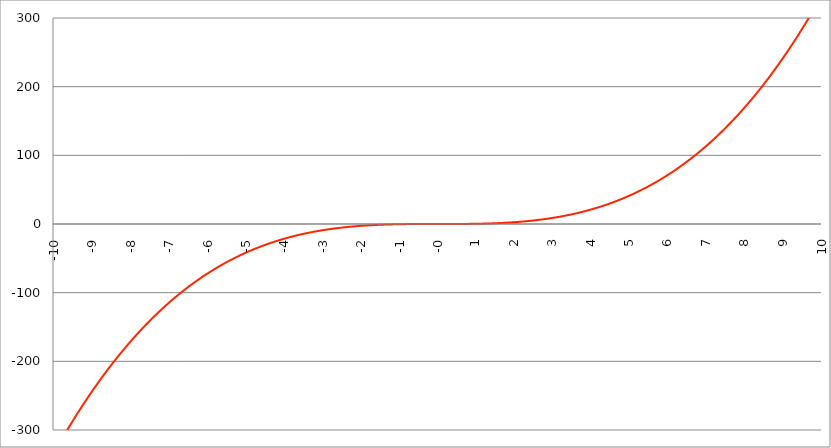
| Category | Series 1 |
|---|---|
| -10.0 | -333.333 |
| -9.99 | -332.334 |
| -9.98 | -331.337 |
| -9.97 | -330.342 |
| -9.96 | -329.349 |
| -9.95 | -328.358 |
| -9.940000000000001 | -327.369 |
| -9.930000000000001 | -326.382 |
| -9.920000000000002 | -325.397 |
| -9.91 | -324.414 |
| -9.900000000000002 | -323.433 |
| -9.890000000000002 | -322.454 |
| -9.880000000000003 | -321.477 |
| -9.870000000000003 | -320.502 |
| -9.860000000000001 | -319.528 |
| -9.850000000000003 | -318.557 |
| -9.840000000000003 | -317.588 |
| -9.830000000000004 | -316.621 |
| -9.820000000000004 | -315.655 |
| -9.810000000000004 | -314.692 |
| -9.800000000000004 | -313.731 |
| -9.790000000000004 | -312.771 |
| -9.780000000000005 | -311.814 |
| -9.770000000000005 | -310.858 |
| -9.760000000000005 | -309.905 |
| -9.750000000000005 | -308.953 |
| -9.740000000000006 | -308.003 |
| -9.730000000000006 | -307.056 |
| -9.720000000000006 | -306.11 |
| -9.710000000000006 | -305.166 |
| -9.700000000000006 | -304.224 |
| -9.690000000000007 | -303.284 |
| -9.680000000000007 | -302.346 |
| -9.670000000000007 | -301.41 |
| -9.660000000000007 | -300.476 |
| -9.650000000000007 | -299.544 |
| -9.640000000000008 | -298.614 |
| -9.630000000000008 | -297.685 |
| -9.620000000000008 | -296.759 |
| -9.610000000000008 | -295.835 |
| -9.600000000000009 | -294.912 |
| -9.590000000000009 | -293.991 |
| -9.580000000000007 | -293.073 |
| -9.57000000000001 | -292.156 |
| -9.56000000000001 | -291.241 |
| -9.55000000000001 | -290.328 |
| -9.54000000000001 | -289.417 |
| -9.53000000000001 | -288.508 |
| -9.52000000000001 | -287.6 |
| -9.51000000000001 | -286.695 |
| -9.50000000000001 | -285.792 |
| -9.49000000000001 | -284.89 |
| -9.48000000000001 | -283.99 |
| -9.47000000000001 | -283.093 |
| -9.46000000000001 | -282.197 |
| -9.45000000000001 | -281.303 |
| -9.44000000000001 | -280.411 |
| -9.430000000000012 | -279.521 |
| -9.420000000000012 | -278.632 |
| -9.410000000000013 | -277.746 |
| -9.400000000000013 | -276.861 |
| -9.390000000000011 | -275.979 |
| -9.380000000000013 | -275.098 |
| -9.370000000000013 | -274.219 |
| -9.360000000000014 | -273.342 |
| -9.350000000000014 | -272.467 |
| -9.340000000000014 | -271.594 |
| -9.330000000000014 | -270.722 |
| -9.320000000000014 | -269.853 |
| -9.310000000000015 | -268.985 |
| -9.300000000000013 | -268.119 |
| -9.290000000000015 | -267.255 |
| -9.280000000000015 | -266.393 |
| -9.270000000000016 | -265.533 |
| -9.260000000000016 | -264.674 |
| -9.250000000000014 | -263.818 |
| -9.240000000000016 | -262.963 |
| -9.230000000000016 | -262.11 |
| -9.220000000000017 | -261.259 |
| -9.210000000000017 | -260.41 |
| -9.200000000000017 | -259.563 |
| -9.190000000000017 | -258.717 |
| -9.180000000000017 | -257.874 |
| -9.170000000000018 | -257.032 |
| -9.160000000000016 | -256.192 |
| -9.150000000000018 | -255.354 |
| -9.140000000000018 | -254.517 |
| -9.130000000000019 | -253.683 |
| -9.120000000000019 | -252.85 |
| -9.110000000000017 | -252.019 |
| -9.10000000000002 | -251.19 |
| -9.09000000000002 | -250.363 |
| -9.08000000000002 | -249.538 |
| -9.07000000000002 | -248.714 |
| -9.06000000000002 | -247.892 |
| -9.05000000000002 | -247.073 |
| -9.04000000000002 | -246.254 |
| -9.03000000000002 | -245.438 |
| -9.020000000000021 | -244.624 |
| -9.010000000000021 | -243.811 |
| -9.000000000000021 | -243 |
| -8.990000000000022 | -242.191 |
| -8.980000000000022 | -241.384 |
| -8.97000000000002 | -240.578 |
| -8.960000000000022 | -239.774 |
| -8.950000000000022 | -238.972 |
| -8.940000000000023 | -238.172 |
| -8.930000000000023 | -237.374 |
| -8.920000000000023 | -236.577 |
| -8.910000000000023 | -235.783 |
| -8.900000000000023 | -234.99 |
| -8.890000000000024 | -234.198 |
| -8.880000000000024 | -233.409 |
| -8.870000000000024 | -232.621 |
| -8.860000000000024 | -231.835 |
| -8.850000000000025 | -231.051 |
| -8.840000000000025 | -230.269 |
| -8.830000000000025 | -229.488 |
| -8.820000000000025 | -228.71 |
| -8.810000000000025 | -227.933 |
| -8.800000000000026 | -227.157 |
| -8.790000000000026 | -226.384 |
| -8.780000000000026 | -225.612 |
| -8.770000000000026 | -224.842 |
| -8.760000000000026 | -224.074 |
| -8.750000000000027 | -223.307 |
| -8.740000000000027 | -222.543 |
| -8.730000000000027 | -221.78 |
| -8.720000000000027 | -221.018 |
| -8.710000000000027 | -220.259 |
| -8.700000000000028 | -219.501 |
| -8.690000000000028 | -218.745 |
| -8.680000000000028 | -217.991 |
| -8.670000000000028 | -217.238 |
| -8.660000000000029 | -216.487 |
| -8.650000000000029 | -215.738 |
| -8.640000000000029 | -214.991 |
| -8.63000000000003 | -214.245 |
| -8.62000000000003 | -213.501 |
| -8.61000000000003 | -212.759 |
| -8.60000000000003 | -212.019 |
| -8.59000000000003 | -211.28 |
| -8.58000000000003 | -210.543 |
| -8.57000000000003 | -209.808 |
| -8.56000000000003 | -209.074 |
| -8.55000000000003 | -208.342 |
| -8.540000000000031 | -207.612 |
| -8.530000000000031 | -206.883 |
| -8.520000000000032 | -206.157 |
| -8.510000000000032 | -205.432 |
| -8.50000000000003 | -204.708 |
| -8.490000000000032 | -203.987 |
| -8.480000000000032 | -203.267 |
| -8.470000000000033 | -202.548 |
| -8.460000000000033 | -201.832 |
| -8.450000000000033 | -201.117 |
| -8.440000000000033 | -200.404 |
| -8.430000000000033 | -199.692 |
| -8.420000000000034 | -198.983 |
| -8.410000000000032 | -198.274 |
| -8.400000000000034 | -197.568 |
| -8.390000000000034 | -196.863 |
| -8.380000000000035 | -196.16 |
| -8.370000000000035 | -195.459 |
| -8.360000000000033 | -194.759 |
| -8.350000000000035 | -194.061 |
| -8.340000000000035 | -193.365 |
| -8.330000000000036 | -192.67 |
| -8.320000000000036 | -191.977 |
| -8.310000000000034 | -191.285 |
| -8.300000000000036 | -190.596 |
| -8.290000000000036 | -189.908 |
| -8.280000000000037 | -189.221 |
| -8.270000000000037 | -188.536 |
| -8.260000000000037 | -187.853 |
| -8.250000000000037 | -187.172 |
| -8.240000000000038 | -186.492 |
| -8.230000000000038 | -185.814 |
| -8.220000000000038 | -185.137 |
| -8.210000000000038 | -184.463 |
| -8.200000000000038 | -183.789 |
| -8.190000000000039 | -183.118 |
| -8.180000000000039 | -182.448 |
| -8.170000000000037 | -181.78 |
| -8.16000000000004 | -181.113 |
| -8.15000000000004 | -180.448 |
| -8.14000000000004 | -179.784 |
| -8.13000000000004 | -179.123 |
| -8.12000000000004 | -178.462 |
| -8.11000000000004 | -177.804 |
| -8.10000000000004 | -177.147 |
| -8.09000000000004 | -176.492 |
| -8.08000000000004 | -175.838 |
| -8.07000000000004 | -175.186 |
| -8.06000000000004 | -174.536 |
| -8.05000000000004 | -173.887 |
| -8.040000000000042 | -173.239 |
| -8.03000000000004 | -172.594 |
| -8.020000000000042 | -171.95 |
| -8.010000000000042 | -171.307 |
| -8.000000000000043 | -170.667 |
| -7.990000000000043 | -170.027 |
| -7.980000000000043 | -169.39 |
| -7.970000000000043 | -168.754 |
| -7.960000000000043 | -168.119 |
| -7.950000000000044 | -167.487 |
| -7.940000000000044 | -166.855 |
| -7.930000000000044 | -166.226 |
| -7.920000000000044 | -165.598 |
| -7.910000000000044 | -164.971 |
| -7.900000000000044 | -164.346 |
| -7.890000000000045 | -163.723 |
| -7.880000000000045 | -163.101 |
| -7.870000000000045 | -162.481 |
| -7.860000000000046 | -161.863 |
| -7.850000000000046 | -161.246 |
| -7.840000000000046 | -160.63 |
| -7.830000000000046 | -160.016 |
| -7.820000000000046 | -159.404 |
| -7.810000000000047 | -158.793 |
| -7.800000000000047 | -158.184 |
| -7.790000000000047 | -157.576 |
| -7.780000000000047 | -156.97 |
| -7.770000000000047 | -156.366 |
| -7.760000000000048 | -155.763 |
| -7.750000000000048 | -155.161 |
| -7.740000000000048 | -154.562 |
| -7.730000000000048 | -153.963 |
| -7.720000000000049 | -153.367 |
| -7.710000000000049 | -152.771 |
| -7.700000000000049 | -152.178 |
| -7.690000000000049 | -151.586 |
| -7.680000000000049 | -150.995 |
| -7.67000000000005 | -150.406 |
| -7.66000000000005 | -149.818 |
| -7.65000000000005 | -149.232 |
| -7.64000000000005 | -148.648 |
| -7.63000000000005 | -148.065 |
| -7.620000000000051 | -147.484 |
| -7.610000000000051 | -146.904 |
| -7.600000000000051 | -146.325 |
| -7.590000000000051 | -145.748 |
| -7.580000000000052 | -145.173 |
| -7.570000000000052 | -144.599 |
| -7.560000000000052 | -144.027 |
| -7.550000000000052 | -143.456 |
| -7.540000000000052 | -142.887 |
| -7.530000000000053 | -142.319 |
| -7.520000000000053 | -141.753 |
| -7.510000000000053 | -141.188 |
| -7.500000000000053 | -140.625 |
| -7.490000000000053 | -140.063 |
| -7.480000000000054 | -139.503 |
| -7.470000000000054 | -138.944 |
| -7.460000000000054 | -138.387 |
| -7.450000000000054 | -137.831 |
| -7.440000000000054 | -137.277 |
| -7.430000000000054 | -136.724 |
| -7.420000000000055 | -136.173 |
| -7.410000000000055 | -135.623 |
| -7.400000000000055 | -135.075 |
| -7.390000000000056 | -134.528 |
| -7.380000000000056 | -133.982 |
| -7.370000000000056 | -133.439 |
| -7.360000000000056 | -132.896 |
| -7.350000000000056 | -132.355 |
| -7.340000000000057 | -131.816 |
| -7.330000000000057 | -131.278 |
| -7.320000000000057 | -130.741 |
| -7.310000000000057 | -130.206 |
| -7.300000000000058 | -129.672 |
| -7.290000000000058 | -129.14 |
| -7.280000000000058 | -128.609 |
| -7.270000000000058 | -128.08 |
| -7.260000000000058 | -127.552 |
| -7.250000000000059 | -127.026 |
| -7.240000000000059 | -126.501 |
| -7.23000000000006 | -125.978 |
| -7.220000000000059 | -125.456 |
| -7.210000000000059 | -124.935 |
| -7.20000000000006 | -124.416 |
| -7.19000000000006 | -123.898 |
| -7.18000000000006 | -123.382 |
| -7.17000000000006 | -122.867 |
| -7.160000000000061 | -122.354 |
| -7.150000000000061 | -121.842 |
| -7.140000000000061 | -121.331 |
| -7.130000000000061 | -120.822 |
| -7.120000000000061 | -120.315 |
| -7.110000000000062 | -119.808 |
| -7.100000000000062 | -119.304 |
| -7.090000000000062 | -118.8 |
| -7.080000000000062 | -118.298 |
| -7.070000000000062 | -117.798 |
| -7.060000000000063 | -117.299 |
| -7.050000000000063 | -116.801 |
| -7.040000000000063 | -116.305 |
| -7.030000000000063 | -115.81 |
| -7.020000000000064 | -115.316 |
| -7.010000000000064 | -114.824 |
| -7.000000000000064 | -114.333 |
| -6.990000000000064 | -113.844 |
| -6.980000000000064 | -113.356 |
| -6.970000000000064 | -112.87 |
| -6.960000000000064 | -112.385 |
| -6.950000000000064 | -111.901 |
| -6.940000000000065 | -111.418 |
| -6.930000000000065 | -110.938 |
| -6.920000000000065 | -110.458 |
| -6.910000000000065 | -109.98 |
| -6.900000000000066 | -109.503 |
| -6.890000000000066 | -109.028 |
| -6.880000000000066 | -108.554 |
| -6.870000000000066 | -108.081 |
| -6.860000000000067 | -107.61 |
| -6.850000000000067 | -107.14 |
| -6.840000000000067 | -106.671 |
| -6.830000000000067 | -106.204 |
| -6.820000000000068 | -105.738 |
| -6.810000000000068 | -105.274 |
| -6.800000000000068 | -104.811 |
| -6.790000000000068 | -104.349 |
| -6.780000000000068 | -103.889 |
| -6.770000000000068 | -103.43 |
| -6.760000000000069 | -102.972 |
| -6.75000000000007 | -102.516 |
| -6.74000000000007 | -102.061 |
| -6.73000000000007 | -101.607 |
| -6.72000000000007 | -101.155 |
| -6.71000000000007 | -100.704 |
| -6.70000000000007 | -100.254 |
| -6.69000000000007 | -99.806 |
| -6.680000000000071 | -99.359 |
| -6.670000000000071 | -98.914 |
| -6.660000000000071 | -98.469 |
| -6.650000000000071 | -98.027 |
| -6.640000000000072 | -97.585 |
| -6.630000000000072 | -97.145 |
| -6.620000000000072 | -96.706 |
| -6.610000000000072 | -96.268 |
| -6.600000000000072 | -95.832 |
| -6.590000000000073 | -95.397 |
| -6.580000000000073 | -94.963 |
| -6.570000000000073 | -94.531 |
| -6.560000000000073 | -94.1 |
| -6.550000000000074 | -93.67 |
| -6.540000000000074 | -93.242 |
| -6.530000000000074 | -92.815 |
| -6.520000000000074 | -92.389 |
| -6.510000000000074 | -91.965 |
| -6.500000000000074 | -91.542 |
| -6.490000000000074 | -91.12 |
| -6.480000000000074 | -90.699 |
| -6.470000000000075 | -90.28 |
| -6.460000000000075 | -89.862 |
| -6.450000000000075 | -89.445 |
| -6.440000000000075 | -89.03 |
| -6.430000000000076 | -88.616 |
| -6.420000000000076 | -88.203 |
| -6.410000000000076 | -87.792 |
| -6.400000000000076 | -87.381 |
| -6.390000000000077 | -86.972 |
| -6.380000000000077 | -86.565 |
| -6.370000000000077 | -86.158 |
| -6.360000000000078 | -85.753 |
| -6.350000000000078 | -85.349 |
| -6.340000000000078 | -84.947 |
| -6.330000000000078 | -84.545 |
| -6.320000000000078 | -84.145 |
| -6.310000000000079 | -83.747 |
| -6.300000000000079 | -83.349 |
| -6.29000000000008 | -82.953 |
| -6.28000000000008 | -82.558 |
| -6.27000000000008 | -82.164 |
| -6.26000000000008 | -81.771 |
| -6.25000000000008 | -81.38 |
| -6.24000000000008 | -80.99 |
| -6.23000000000008 | -80.601 |
| -6.220000000000081 | -80.214 |
| -6.210000000000081 | -79.828 |
| -6.200000000000081 | -79.443 |
| -6.190000000000081 | -79.059 |
| -6.180000000000081 | -78.676 |
| -6.170000000000082 | -78.295 |
| -6.160000000000082 | -77.915 |
| -6.150000000000082 | -77.536 |
| -6.140000000000082 | -77.159 |
| -6.130000000000082 | -76.782 |
| -6.120000000000083 | -76.407 |
| -6.110000000000083 | -76.033 |
| -6.100000000000083 | -75.66 |
| -6.090000000000083 | -75.289 |
| -6.080000000000084 | -74.919 |
| -6.070000000000084 | -74.55 |
| -6.060000000000084 | -74.182 |
| -6.050000000000084 | -73.815 |
| -6.040000000000084 | -73.45 |
| -6.030000000000084 | -73.085 |
| -6.020000000000085 | -72.722 |
| -6.010000000000085 | -72.361 |
| -6.000000000000085 | -72 |
| -5.990000000000085 | -71.641 |
| -5.980000000000085 | -71.282 |
| -5.970000000000085 | -70.925 |
| -5.960000000000086 | -70.57 |
| -5.950000000000086 | -70.215 |
| -5.940000000000086 | -69.862 |
| -5.930000000000086 | -69.509 |
| -5.920000000000087 | -69.158 |
| -5.910000000000087 | -68.808 |
| -5.900000000000087 | -68.46 |
| -5.890000000000088 | -68.112 |
| -5.880000000000088 | -67.766 |
| -5.870000000000088 | -67.421 |
| -5.860000000000088 | -67.077 |
| -5.850000000000088 | -66.734 |
| -5.840000000000089 | -66.392 |
| -5.830000000000089 | -66.052 |
| -5.820000000000089 | -65.712 |
| -5.810000000000089 | -65.374 |
| -5.800000000000089 | -65.037 |
| -5.79000000000009 | -64.702 |
| -5.78000000000009 | -64.367 |
| -5.77000000000009 | -64.033 |
| -5.76000000000009 | -63.701 |
| -5.750000000000091 | -63.37 |
| -5.740000000000091 | -63.04 |
| -5.730000000000091 | -62.711 |
| -5.720000000000091 | -62.383 |
| -5.710000000000091 | -62.056 |
| -5.700000000000092 | -61.731 |
| -5.690000000000092 | -61.407 |
| -5.680000000000092 | -61.083 |
| -5.670000000000092 | -60.761 |
| -5.660000000000092 | -60.44 |
| -5.650000000000093 | -60.121 |
| -5.640000000000093 | -59.802 |
| -5.630000000000093 | -59.485 |
| -5.620000000000093 | -59.168 |
| -5.610000000000093 | -58.853 |
| -5.600000000000094 | -58.539 |
| -5.590000000000094 | -58.226 |
| -5.580000000000094 | -57.914 |
| -5.570000000000094 | -57.603 |
| -5.560000000000095 | -57.293 |
| -5.550000000000095 | -56.985 |
| -5.540000000000095 | -56.677 |
| -5.530000000000095 | -56.371 |
| -5.520000000000095 | -56.066 |
| -5.510000000000096 | -55.761 |
| -5.500000000000096 | -55.458 |
| -5.490000000000096 | -55.156 |
| -5.480000000000096 | -54.856 |
| -5.470000000000096 | -54.556 |
| -5.460000000000097 | -54.257 |
| -5.450000000000097 | -53.96 |
| -5.440000000000097 | -53.663 |
| -5.430000000000097 | -53.368 |
| -5.420000000000098 | -53.073 |
| -5.410000000000098 | -52.78 |
| -5.400000000000098 | -52.488 |
| -5.390000000000098 | -52.197 |
| -5.380000000000098 | -51.907 |
| -5.370000000000099 | -51.618 |
| -5.360000000000099 | -51.33 |
| -5.350000000000099 | -51.043 |
| -5.340000000000099 | -50.758 |
| -5.330000000000099 | -50.473 |
| -5.3200000000001 | -50.19 |
| -5.3100000000001 | -49.907 |
| -5.3000000000001 | -49.626 |
| -5.2900000000001 | -49.345 |
| -5.2800000000001 | -49.066 |
| -5.2700000000001 | -48.788 |
| -5.260000000000101 | -48.511 |
| -5.250000000000101 | -48.234 |
| -5.240000000000101 | -47.959 |
| -5.230000000000101 | -47.685 |
| -5.220000000000102 | -47.412 |
| -5.210000000000102 | -47.14 |
| -5.200000000000102 | -46.869 |
| -5.190000000000103 | -46.599 |
| -5.180000000000103 | -46.331 |
| -5.170000000000103 | -46.063 |
| -5.160000000000103 | -45.796 |
| -5.150000000000103 | -45.53 |
| -5.140000000000104 | -45.266 |
| -5.130000000000104 | -45.002 |
| -5.120000000000104 | -44.739 |
| -5.110000000000104 | -44.478 |
| -5.100000000000104 | -44.217 |
| -5.090000000000104 | -43.957 |
| -5.080000000000104 | -43.699 |
| -5.070000000000105 | -43.441 |
| -5.060000000000105 | -43.185 |
| -5.050000000000105 | -42.929 |
| -5.040000000000105 | -42.675 |
| -5.030000000000105 | -42.421 |
| -5.020000000000106 | -42.169 |
| -5.010000000000106 | -41.917 |
| -5.000000000000106 | -41.667 |
| -4.990000000000106 | -41.417 |
| -4.980000000000106 | -41.169 |
| -4.970000000000107 | -40.921 |
| -4.960000000000107 | -40.675 |
| -4.950000000000107 | -40.429 |
| -4.940000000000107 | -40.185 |
| -4.930000000000108 | -39.941 |
| -4.920000000000108 | -39.698 |
| -4.910000000000108 | -39.457 |
| -4.900000000000108 | -39.216 |
| -4.890000000000109 | -38.977 |
| -4.88000000000011 | -38.738 |
| -4.87000000000011 | -38.5 |
| -4.86000000000011 | -38.264 |
| -4.85000000000011 | -38.028 |
| -4.84000000000011 | -37.793 |
| -4.83000000000011 | -37.56 |
| -4.82000000000011 | -37.327 |
| -4.810000000000111 | -37.095 |
| -4.800000000000111 | -36.864 |
| -4.790000000000111 | -36.634 |
| -4.780000000000111 | -36.405 |
| -4.770000000000111 | -36.177 |
| -4.760000000000112 | -35.95 |
| -4.750000000000112 | -35.724 |
| -4.740000000000112 | -35.499 |
| -4.730000000000112 | -35.275 |
| -4.720000000000112 | -35.051 |
| -4.710000000000113 | -34.829 |
| -4.700000000000113 | -34.608 |
| -4.690000000000113 | -34.387 |
| -4.680000000000113 | -34.168 |
| -4.670000000000114 | -33.949 |
| -4.660000000000114 | -33.732 |
| -4.650000000000114 | -33.515 |
| -4.640000000000114 | -33.299 |
| -4.630000000000114 | -33.084 |
| -4.620000000000115 | -32.87 |
| -4.610000000000115 | -32.657 |
| -4.600000000000115 | -32.445 |
| -4.590000000000115 | -32.234 |
| -4.580000000000115 | -32.024 |
| -4.570000000000115 | -31.815 |
| -4.560000000000116 | -31.606 |
| -4.550000000000116 | -31.399 |
| -4.540000000000116 | -31.192 |
| -4.530000000000116 | -30.987 |
| -4.520000000000117 | -30.782 |
| -4.510000000000117 | -30.578 |
| -4.500000000000117 | -30.375 |
| -4.490000000000117 | -30.173 |
| -4.480000000000117 | -29.972 |
| -4.470000000000117 | -29.772 |
| -4.460000000000118 | -29.572 |
| -4.450000000000118 | -29.374 |
| -4.440000000000118 | -29.176 |
| -4.430000000000118 | -28.979 |
| -4.420000000000119 | -28.784 |
| -4.41000000000012 | -28.589 |
| -4.40000000000012 | -28.395 |
| -4.39000000000012 | -28.202 |
| -4.38000000000012 | -28.009 |
| -4.37000000000012 | -27.818 |
| -4.36000000000012 | -27.627 |
| -4.35000000000012 | -27.438 |
| -4.34000000000012 | -27.249 |
| -4.33000000000012 | -27.061 |
| -4.320000000000121 | -26.874 |
| -4.310000000000121 | -26.688 |
| -4.300000000000121 | -26.502 |
| -4.290000000000121 | -26.318 |
| -4.280000000000121 | -26.134 |
| -4.270000000000122 | -25.951 |
| -4.260000000000122 | -25.77 |
| -4.250000000000122 | -25.589 |
| -4.240000000000122 | -25.408 |
| -4.230000000000122 | -25.229 |
| -4.220000000000123 | -25.05 |
| -4.210000000000123 | -24.873 |
| -4.200000000000123 | -24.696 |
| -4.190000000000124 | -24.52 |
| -4.180000000000124 | -24.345 |
| -4.170000000000124 | -24.171 |
| -4.160000000000124 | -23.997 |
| -4.150000000000124 | -23.824 |
| -4.140000000000124 | -23.653 |
| -4.130000000000125 | -23.482 |
| -4.120000000000125 | -23.312 |
| -4.110000000000125 | -23.142 |
| -4.100000000000125 | -22.974 |
| -4.090000000000125 | -22.806 |
| -4.080000000000126 | -22.639 |
| -4.070000000000126 | -22.473 |
| -4.060000000000126 | -22.308 |
| -4.050000000000126 | -22.143 |
| -4.040000000000127 | -21.98 |
| -4.030000000000127 | -21.817 |
| -4.020000000000127 | -21.655 |
| -4.010000000000127 | -21.494 |
| -4.000000000000127 | -21.333 |
| -3.990000000000128 | -21.174 |
| -3.980000000000128 | -21.015 |
| -3.970000000000129 | -20.857 |
| -3.960000000000129 | -20.7 |
| -3.950000000000129 | -20.543 |
| -3.940000000000129 | -20.388 |
| -3.930000000000129 | -20.233 |
| -3.92000000000013 | -20.079 |
| -3.91000000000013 | -19.925 |
| -3.90000000000013 | -19.773 |
| -3.89000000000013 | -19.621 |
| -3.88000000000013 | -19.47 |
| -3.870000000000131 | -19.32 |
| -3.860000000000131 | -19.171 |
| -3.850000000000131 | -19.022 |
| -3.840000000000131 | -18.874 |
| -3.830000000000131 | -18.727 |
| -3.820000000000132 | -18.581 |
| -3.810000000000132 | -18.435 |
| -3.800000000000132 | -18.291 |
| -3.790000000000132 | -18.147 |
| -3.780000000000132 | -18.003 |
| -3.770000000000133 | -17.861 |
| -3.760000000000133 | -17.719 |
| -3.750000000000133 | -17.578 |
| -3.740000000000133 | -17.438 |
| -3.730000000000134 | -17.298 |
| -3.720000000000134 | -17.16 |
| -3.710000000000134 | -17.022 |
| -3.700000000000134 | -16.884 |
| -3.690000000000134 | -16.748 |
| -3.680000000000135 | -16.612 |
| -3.670000000000135 | -16.477 |
| -3.660000000000135 | -16.343 |
| -3.650000000000135 | -16.209 |
| -3.640000000000135 | -16.076 |
| -3.630000000000136 | -15.944 |
| -3.620000000000136 | -15.813 |
| -3.610000000000136 | -15.682 |
| -3.600000000000136 | -15.552 |
| -3.590000000000137 | -15.423 |
| -3.580000000000137 | -15.294 |
| -3.570000000000137 | -15.166 |
| -3.560000000000137 | -15.039 |
| -3.550000000000137 | -14.913 |
| -3.540000000000138 | -14.787 |
| -3.530000000000138 | -14.662 |
| -3.520000000000138 | -14.538 |
| -3.510000000000138 | -14.415 |
| -3.500000000000139 | -14.292 |
| -3.490000000000139 | -14.17 |
| -3.480000000000139 | -14.048 |
| -3.470000000000139 | -13.927 |
| -3.460000000000139 | -13.807 |
| -3.45000000000014 | -13.688 |
| -3.44000000000014 | -13.569 |
| -3.43000000000014 | -13.451 |
| -3.42000000000014 | -13.334 |
| -3.41000000000014 | -13.217 |
| -3.400000000000141 | -13.101 |
| -3.390000000000141 | -12.986 |
| -3.380000000000141 | -12.871 |
| -3.370000000000141 | -12.758 |
| -3.360000000000141 | -12.644 |
| -3.350000000000142 | -12.532 |
| -3.340000000000142 | -12.42 |
| -3.330000000000142 | -12.309 |
| -3.320000000000142 | -12.198 |
| -3.310000000000143 | -12.088 |
| -3.300000000000143 | -11.979 |
| -3.290000000000143 | -11.87 |
| -3.280000000000143 | -11.763 |
| -3.270000000000143 | -11.655 |
| -3.260000000000144 | -11.549 |
| -3.250000000000144 | -11.443 |
| -3.240000000000144 | -11.337 |
| -3.230000000000144 | -11.233 |
| -3.220000000000145 | -11.129 |
| -3.210000000000145 | -11.025 |
| -3.200000000000145 | -10.923 |
| -3.190000000000145 | -10.821 |
| -3.180000000000145 | -10.719 |
| -3.170000000000146 | -10.618 |
| -3.160000000000146 | -10.518 |
| -3.150000000000146 | -10.419 |
| -3.140000000000146 | -10.32 |
| -3.130000000000146 | -10.221 |
| -3.120000000000147 | -10.124 |
| -3.110000000000147 | -10.027 |
| -3.100000000000147 | -9.93 |
| -3.090000000000147 | -9.835 |
| -3.080000000000147 | -9.739 |
| -3.070000000000148 | -9.645 |
| -3.060000000000148 | -9.551 |
| -3.050000000000148 | -9.458 |
| -3.040000000000148 | -9.365 |
| -3.030000000000149 | -9.273 |
| -3.020000000000149 | -9.181 |
| -3.010000000000149 | -9.09 |
| -3.000000000000149 | -9 |
| -2.990000000000149 | -8.91 |
| -2.98000000000015 | -8.821 |
| -2.97000000000015 | -8.733 |
| -2.96000000000015 | -8.645 |
| -2.95000000000015 | -8.557 |
| -2.94000000000015 | -8.471 |
| -2.930000000000151 | -8.385 |
| -2.920000000000151 | -8.299 |
| -2.910000000000151 | -8.214 |
| -2.900000000000151 | -8.13 |
| -2.890000000000151 | -8.046 |
| -2.880000000000152 | -7.963 |
| -2.870000000000152 | -7.88 |
| -2.860000000000152 | -7.798 |
| -2.850000000000152 | -7.716 |
| -2.840000000000153 | -7.635 |
| -2.830000000000153 | -7.555 |
| -2.820000000000153 | -7.475 |
| -2.810000000000153 | -7.396 |
| -2.800000000000153 | -7.317 |
| -2.790000000000154 | -7.239 |
| -2.780000000000154 | -7.162 |
| -2.770000000000154 | -7.085 |
| -2.760000000000154 | -7.008 |
| -2.750000000000154 | -6.932 |
| -2.740000000000155 | -6.857 |
| -2.730000000000155 | -6.782 |
| -2.720000000000155 | -6.708 |
| -2.710000000000155 | -6.634 |
| -2.700000000000156 | -6.561 |
| -2.690000000000156 | -6.488 |
| -2.680000000000156 | -6.416 |
| -2.670000000000156 | -6.345 |
| -2.660000000000156 | -6.274 |
| -2.650000000000157 | -6.203 |
| -2.640000000000157 | -6.133 |
| -2.630000000000157 | -6.064 |
| -2.620000000000157 | -5.995 |
| -2.610000000000157 | -5.927 |
| -2.600000000000158 | -5.859 |
| -2.590000000000158 | -5.791 |
| -2.580000000000158 | -5.725 |
| -2.570000000000158 | -5.658 |
| -2.560000000000159 | -5.592 |
| -2.550000000000159 | -5.527 |
| -2.54000000000016 | -5.462 |
| -2.530000000000159 | -5.398 |
| -2.520000000000159 | -5.334 |
| -2.51000000000016 | -5.271 |
| -2.50000000000016 | -5.208 |
| -2.49000000000016 | -5.146 |
| -2.48000000000016 | -5.084 |
| -2.47000000000016 | -5.023 |
| -2.460000000000161 | -4.962 |
| -2.450000000000161 | -4.902 |
| -2.440000000000161 | -4.842 |
| -2.430000000000161 | -4.783 |
| -2.420000000000162 | -4.724 |
| -2.410000000000162 | -4.666 |
| -2.400000000000162 | -4.608 |
| -2.390000000000162 | -4.551 |
| -2.380000000000162 | -4.494 |
| -2.370000000000163 | -4.437 |
| -2.360000000000163 | -4.381 |
| -2.350000000000163 | -4.326 |
| -2.340000000000163 | -4.271 |
| -2.330000000000163 | -4.216 |
| -2.320000000000164 | -4.162 |
| -2.310000000000164 | -4.109 |
| -2.300000000000164 | -4.056 |
| -2.290000000000164 | -4.003 |
| -2.280000000000165 | -3.951 |
| -2.270000000000165 | -3.899 |
| -2.260000000000165 | -3.848 |
| -2.250000000000165 | -3.797 |
| -2.240000000000165 | -3.746 |
| -2.230000000000166 | -3.697 |
| -2.220000000000166 | -3.647 |
| -2.210000000000166 | -3.598 |
| -2.200000000000166 | -3.549 |
| -2.190000000000166 | -3.501 |
| -2.180000000000167 | -3.453 |
| -2.170000000000167 | -3.406 |
| -2.160000000000167 | -3.359 |
| -2.150000000000167 | -3.313 |
| -2.140000000000168 | -3.267 |
| -2.130000000000168 | -3.221 |
| -2.120000000000168 | -3.176 |
| -2.110000000000168 | -3.131 |
| -2.100000000000168 | -3.087 |
| -2.090000000000169 | -3.043 |
| -2.080000000000169 | -3 |
| -2.070000000000169 | -2.957 |
| -2.060000000000169 | -2.914 |
| -2.050000000000169 | -2.872 |
| -2.04000000000017 | -2.83 |
| -2.03000000000017 | -2.788 |
| -2.02000000000017 | -2.747 |
| -2.01000000000017 | -2.707 |
| -2.000000000000171 | -2.667 |
| -1.99000000000017 | -2.627 |
| -1.98000000000017 | -2.587 |
| -1.97000000000017 | -2.548 |
| -1.96000000000017 | -2.51 |
| -1.95000000000017 | -2.472 |
| -1.94000000000017 | -2.434 |
| -1.93000000000017 | -2.396 |
| -1.92000000000017 | -2.359 |
| -1.91000000000017 | -2.323 |
| -1.90000000000017 | -2.286 |
| -1.89000000000017 | -2.25 |
| -1.88000000000017 | -2.215 |
| -1.87000000000017 | -2.18 |
| -1.86000000000017 | -2.145 |
| -1.85000000000017 | -2.111 |
| -1.84000000000017 | -2.077 |
| -1.83000000000017 | -2.043 |
| -1.82000000000017 | -2.01 |
| -1.81000000000017 | -1.977 |
| -1.80000000000017 | -1.944 |
| -1.79000000000017 | -1.912 |
| -1.78000000000017 | -1.88 |
| -1.77000000000017 | -1.848 |
| -1.76000000000017 | -1.817 |
| -1.75000000000017 | -1.786 |
| -1.74000000000017 | -1.756 |
| -1.73000000000017 | -1.726 |
| -1.72000000000017 | -1.696 |
| -1.71000000000017 | -1.667 |
| -1.70000000000017 | -1.638 |
| -1.69000000000017 | -1.609 |
| -1.68000000000017 | -1.581 |
| -1.67000000000017 | -1.552 |
| -1.66000000000017 | -1.525 |
| -1.65000000000017 | -1.497 |
| -1.64000000000017 | -1.47 |
| -1.63000000000017 | -1.444 |
| -1.62000000000017 | -1.417 |
| -1.61000000000017 | -1.391 |
| -1.60000000000017 | -1.365 |
| -1.59000000000017 | -1.34 |
| -1.58000000000017 | -1.315 |
| -1.57000000000017 | -1.29 |
| -1.56000000000017 | -1.265 |
| -1.55000000000017 | -1.241 |
| -1.54000000000017 | -1.217 |
| -1.53000000000017 | -1.194 |
| -1.52000000000017 | -1.171 |
| -1.51000000000017 | -1.148 |
| -1.50000000000017 | -1.125 |
| -1.49000000000017 | -1.103 |
| -1.48000000000017 | -1.081 |
| -1.47000000000017 | -1.059 |
| -1.46000000000017 | -1.037 |
| -1.45000000000017 | -1.016 |
| -1.44000000000017 | -0.995 |
| -1.43000000000017 | -0.975 |
| -1.42000000000017 | -0.954 |
| -1.41000000000017 | -0.934 |
| -1.40000000000017 | -0.915 |
| -1.39000000000017 | -0.895 |
| -1.38000000000017 | -0.876 |
| -1.37000000000017 | -0.857 |
| -1.36000000000017 | -0.838 |
| -1.35000000000017 | -0.82 |
| -1.34000000000017 | -0.802 |
| -1.33000000000017 | -0.784 |
| -1.32000000000017 | -0.767 |
| -1.31000000000017 | -0.749 |
| -1.30000000000017 | -0.732 |
| -1.29000000000017 | -0.716 |
| -1.28000000000017 | -0.699 |
| -1.27000000000017 | -0.683 |
| -1.26000000000017 | -0.667 |
| -1.25000000000017 | -0.651 |
| -1.24000000000017 | -0.636 |
| -1.23000000000017 | -0.62 |
| -1.22000000000017 | -0.605 |
| -1.21000000000017 | -0.591 |
| -1.20000000000017 | -0.576 |
| -1.19000000000017 | -0.562 |
| -1.18000000000017 | -0.548 |
| -1.17000000000017 | -0.534 |
| -1.16000000000017 | -0.52 |
| -1.15000000000017 | -0.507 |
| -1.14000000000017 | -0.494 |
| -1.13000000000017 | -0.481 |
| -1.12000000000017 | -0.468 |
| -1.11000000000017 | -0.456 |
| -1.10000000000017 | -0.444 |
| -1.09000000000017 | -0.432 |
| -1.08000000000017 | -0.42 |
| -1.07000000000017 | -0.408 |
| -1.06000000000017 | -0.397 |
| -1.05000000000017 | -0.386 |
| -1.04000000000017 | -0.375 |
| -1.03000000000017 | -0.364 |
| -1.02000000000017 | -0.354 |
| -1.01000000000017 | -0.343 |
| -1.00000000000017 | -0.333 |
| -0.99000000000017 | -0.323 |
| -0.98000000000017 | -0.314 |
| -0.97000000000017 | -0.304 |
| -0.96000000000017 | -0.295 |
| -0.95000000000017 | -0.286 |
| -0.94000000000017 | -0.277 |
| -0.93000000000017 | -0.268 |
| -0.92000000000017 | -0.26 |
| -0.91000000000017 | -0.251 |
| -0.90000000000017 | -0.243 |
| -0.890000000000169 | -0.235 |
| -0.880000000000169 | -0.227 |
| -0.870000000000169 | -0.22 |
| -0.860000000000169 | -0.212 |
| -0.850000000000169 | -0.205 |
| -0.840000000000169 | -0.198 |
| -0.830000000000169 | -0.191 |
| -0.820000000000169 | -0.184 |
| -0.810000000000169 | -0.177 |
| -0.800000000000169 | -0.171 |
| -0.790000000000169 | -0.164 |
| -0.780000000000169 | -0.158 |
| -0.770000000000169 | -0.152 |
| -0.760000000000169 | -0.146 |
| -0.750000000000169 | -0.141 |
| -0.740000000000169 | -0.135 |
| -0.730000000000169 | -0.13 |
| -0.720000000000169 | -0.124 |
| -0.710000000000169 | -0.119 |
| -0.700000000000169 | -0.114 |
| -0.690000000000169 | -0.11 |
| -0.680000000000169 | -0.105 |
| -0.670000000000169 | -0.1 |
| -0.660000000000169 | -0.096 |
| -0.650000000000169 | -0.092 |
| -0.640000000000169 | -0.087 |
| -0.630000000000169 | -0.083 |
| -0.620000000000169 | -0.079 |
| -0.610000000000169 | -0.076 |
| -0.600000000000169 | -0.072 |
| -0.590000000000169 | -0.068 |
| -0.580000000000169 | -0.065 |
| -0.570000000000169 | -0.062 |
| -0.560000000000169 | -0.059 |
| -0.550000000000169 | -0.055 |
| -0.540000000000169 | -0.052 |
| -0.530000000000169 | -0.05 |
| -0.520000000000169 | -0.047 |
| -0.510000000000169 | -0.044 |
| -0.500000000000169 | -0.042 |
| -0.490000000000169 | -0.039 |
| -0.480000000000169 | -0.037 |
| -0.470000000000169 | -0.035 |
| -0.460000000000169 | -0.032 |
| -0.450000000000169 | -0.03 |
| -0.440000000000169 | -0.028 |
| -0.430000000000169 | -0.027 |
| -0.420000000000169 | -0.025 |
| -0.410000000000169 | -0.023 |
| -0.400000000000169 | -0.021 |
| -0.390000000000169 | -0.02 |
| -0.380000000000169 | -0.018 |
| -0.370000000000169 | -0.017 |
| -0.360000000000169 | -0.016 |
| -0.350000000000169 | -0.014 |
| -0.340000000000169 | -0.013 |
| -0.330000000000169 | -0.012 |
| -0.320000000000169 | -0.011 |
| -0.310000000000169 | -0.01 |
| -0.300000000000169 | -0.009 |
| -0.290000000000169 | -0.008 |
| -0.280000000000169 | -0.007 |
| -0.270000000000169 | -0.007 |
| -0.260000000000169 | -0.006 |
| -0.250000000000169 | -0.005 |
| -0.240000000000169 | -0.005 |
| -0.230000000000169 | -0.004 |
| -0.220000000000169 | -0.004 |
| -0.210000000000169 | -0.003 |
| -0.200000000000169 | -0.003 |
| -0.190000000000169 | -0.002 |
| -0.180000000000169 | -0.002 |
| -0.170000000000169 | -0.002 |
| -0.160000000000169 | -0.001 |
| -0.150000000000169 | -0.001 |
| -0.140000000000169 | -0.001 |
| -0.130000000000169 | -0.001 |
| -0.120000000000169 | -0.001 |
| -0.110000000000169 | 0 |
| -0.100000000000169 | 0 |
| -0.0900000000001689 | 0 |
| -0.0800000000001689 | 0 |
| -0.0700000000001689 | 0 |
| -0.0600000000001689 | 0 |
| -0.0500000000001689 | 0 |
| -0.0400000000001689 | 0 |
| -0.0300000000001689 | 0 |
| -0.0200000000001689 | 0 |
| -0.0100000000001689 | 0 |
| -1.6888920817415e-13 | 0 |
| 0.00999999999983111 | 0 |
| 0.0199999999998311 | 0 |
| 0.0299999999998311 | 0 |
| 0.0399999999998311 | 0 |
| 0.0499999999998311 | 0 |
| 0.0599999999998311 | 0 |
| 0.0699999999998311 | 0 |
| 0.0799999999998311 | 0 |
| 0.0899999999998311 | 0 |
| 0.0999999999998311 | 0 |
| 0.109999999999831 | 0 |
| 0.119999999999831 | 0.001 |
| 0.129999999999831 | 0.001 |
| 0.139999999999831 | 0.001 |
| 0.149999999999831 | 0.001 |
| 0.159999999999831 | 0.001 |
| 0.169999999999831 | 0.002 |
| 0.179999999999831 | 0.002 |
| 0.189999999999831 | 0.002 |
| 0.199999999999831 | 0.003 |
| 0.209999999999831 | 0.003 |
| 0.219999999999831 | 0.004 |
| 0.229999999999831 | 0.004 |
| 0.239999999999831 | 0.005 |
| 0.249999999999831 | 0.005 |
| 0.259999999999831 | 0.006 |
| 0.269999999999831 | 0.007 |
| 0.279999999999831 | 0.007 |
| 0.289999999999831 | 0.008 |
| 0.299999999999831 | 0.009 |
| 0.309999999999831 | 0.01 |
| 0.319999999999831 | 0.011 |
| 0.329999999999831 | 0.012 |
| 0.339999999999831 | 0.013 |
| 0.349999999999831 | 0.014 |
| 0.359999999999831 | 0.016 |
| 0.369999999999831 | 0.017 |
| 0.379999999999831 | 0.018 |
| 0.389999999999831 | 0.02 |
| 0.399999999999831 | 0.021 |
| 0.409999999999831 | 0.023 |
| 0.419999999999831 | 0.025 |
| 0.429999999999831 | 0.027 |
| 0.439999999999831 | 0.028 |
| 0.449999999999831 | 0.03 |
| 0.459999999999831 | 0.032 |
| 0.469999999999831 | 0.035 |
| 0.479999999999831 | 0.037 |
| 0.489999999999831 | 0.039 |
| 0.499999999999831 | 0.042 |
| 0.509999999999831 | 0.044 |
| 0.519999999999831 | 0.047 |
| 0.529999999999831 | 0.05 |
| 0.539999999999831 | 0.052 |
| 0.549999999999831 | 0.055 |
| 0.559999999999831 | 0.059 |
| 0.569999999999831 | 0.062 |
| 0.579999999999831 | 0.065 |
| 0.589999999999831 | 0.068 |
| 0.599999999999831 | 0.072 |
| 0.609999999999831 | 0.076 |
| 0.619999999999831 | 0.079 |
| 0.629999999999831 | 0.083 |
| 0.639999999999831 | 0.087 |
| 0.649999999999831 | 0.092 |
| 0.659999999999831 | 0.096 |
| 0.669999999999831 | 0.1 |
| 0.679999999999831 | 0.105 |
| 0.689999999999831 | 0.11 |
| 0.699999999999831 | 0.114 |
| 0.709999999999831 | 0.119 |
| 0.719999999999831 | 0.124 |
| 0.729999999999831 | 0.13 |
| 0.739999999999831 | 0.135 |
| 0.749999999999832 | 0.141 |
| 0.759999999999832 | 0.146 |
| 0.769999999999832 | 0.152 |
| 0.779999999999832 | 0.158 |
| 0.789999999999832 | 0.164 |
| 0.799999999999832 | 0.171 |
| 0.809999999999832 | 0.177 |
| 0.819999999999832 | 0.184 |
| 0.829999999999832 | 0.191 |
| 0.839999999999832 | 0.198 |
| 0.849999999999832 | 0.205 |
| 0.859999999999832 | 0.212 |
| 0.869999999999832 | 0.22 |
| 0.879999999999832 | 0.227 |
| 0.889999999999832 | 0.235 |
| 0.899999999999832 | 0.243 |
| 0.909999999999832 | 0.251 |
| 0.919999999999832 | 0.26 |
| 0.929999999999832 | 0.268 |
| 0.939999999999832 | 0.277 |
| 0.949999999999832 | 0.286 |
| 0.959999999999832 | 0.295 |
| 0.969999999999832 | 0.304 |
| 0.979999999999832 | 0.314 |
| 0.989999999999832 | 0.323 |
| 0.999999999999832 | 0.333 |
| 1.009999999999832 | 0.343 |
| 1.019999999999832 | 0.354 |
| 1.029999999999832 | 0.364 |
| 1.039999999999832 | 0.375 |
| 1.049999999999832 | 0.386 |
| 1.059999999999832 | 0.397 |
| 1.069999999999832 | 0.408 |
| 1.079999999999832 | 0.42 |
| 1.089999999999832 | 0.432 |
| 1.099999999999832 | 0.444 |
| 1.109999999999832 | 0.456 |
| 1.119999999999832 | 0.468 |
| 1.129999999999832 | 0.481 |
| 1.139999999999832 | 0.494 |
| 1.149999999999832 | 0.507 |
| 1.159999999999832 | 0.52 |
| 1.169999999999832 | 0.534 |
| 1.179999999999832 | 0.548 |
| 1.189999999999832 | 0.562 |
| 1.199999999999832 | 0.576 |
| 1.209999999999832 | 0.591 |
| 1.219999999999832 | 0.605 |
| 1.229999999999832 | 0.62 |
| 1.239999999999832 | 0.636 |
| 1.249999999999832 | 0.651 |
| 1.259999999999832 | 0.667 |
| 1.269999999999832 | 0.683 |
| 1.279999999999832 | 0.699 |
| 1.289999999999832 | 0.716 |
| 1.299999999999832 | 0.732 |
| 1.309999999999832 | 0.749 |
| 1.319999999999832 | 0.767 |
| 1.329999999999832 | 0.784 |
| 1.339999999999832 | 0.802 |
| 1.349999999999832 | 0.82 |
| 1.359999999999832 | 0.838 |
| 1.369999999999832 | 0.857 |
| 1.379999999999832 | 0.876 |
| 1.389999999999832 | 0.895 |
| 1.399999999999832 | 0.915 |
| 1.409999999999832 | 0.934 |
| 1.419999999999832 | 0.954 |
| 1.429999999999832 | 0.975 |
| 1.439999999999832 | 0.995 |
| 1.449999999999832 | 1.016 |
| 1.459999999999832 | 1.037 |
| 1.469999999999832 | 1.059 |
| 1.479999999999832 | 1.081 |
| 1.489999999999832 | 1.103 |
| 1.499999999999832 | 1.125 |
| 1.509999999999832 | 1.148 |
| 1.519999999999832 | 1.171 |
| 1.529999999999832 | 1.194 |
| 1.539999999999832 | 1.217 |
| 1.549999999999832 | 1.241 |
| 1.559999999999832 | 1.265 |
| 1.569999999999832 | 1.29 |
| 1.579999999999832 | 1.315 |
| 1.589999999999832 | 1.34 |
| 1.599999999999832 | 1.365 |
| 1.609999999999832 | 1.391 |
| 1.619999999999832 | 1.417 |
| 1.629999999999832 | 1.444 |
| 1.639999999999832 | 1.47 |
| 1.649999999999832 | 1.497 |
| 1.659999999999832 | 1.525 |
| 1.669999999999832 | 1.552 |
| 1.679999999999832 | 1.581 |
| 1.689999999999832 | 1.609 |
| 1.699999999999832 | 1.638 |
| 1.709999999999832 | 1.667 |
| 1.719999999999832 | 1.696 |
| 1.729999999999832 | 1.726 |
| 1.739999999999832 | 1.756 |
| 1.749999999999832 | 1.786 |
| 1.759999999999832 | 1.817 |
| 1.769999999999832 | 1.848 |
| 1.779999999999832 | 1.88 |
| 1.789999999999832 | 1.912 |
| 1.799999999999832 | 1.944 |
| 1.809999999999832 | 1.977 |
| 1.819999999999832 | 2.01 |
| 1.829999999999832 | 2.043 |
| 1.839999999999832 | 2.077 |
| 1.849999999999832 | 2.111 |
| 1.859999999999832 | 2.145 |
| 1.869999999999832 | 2.18 |
| 1.879999999999832 | 2.215 |
| 1.889999999999832 | 2.25 |
| 1.899999999999832 | 2.286 |
| 1.909999999999832 | 2.323 |
| 1.919999999999832 | 2.359 |
| 1.929999999999832 | 2.396 |
| 1.939999999999832 | 2.434 |
| 1.949999999999833 | 2.472 |
| 1.959999999999833 | 2.51 |
| 1.969999999999833 | 2.548 |
| 1.979999999999833 | 2.587 |
| 1.989999999999833 | 2.627 |
| 1.999999999999833 | 2.667 |
| 2.009999999999832 | 2.707 |
| 2.019999999999832 | 2.747 |
| 2.029999999999832 | 2.788 |
| 2.039999999999832 | 2.83 |
| 2.049999999999832 | 2.872 |
| 2.059999999999831 | 2.914 |
| 2.069999999999831 | 2.957 |
| 2.079999999999831 | 3 |
| 2.089999999999831 | 3.043 |
| 2.09999999999983 | 3.087 |
| 2.10999999999983 | 3.131 |
| 2.11999999999983 | 3.176 |
| 2.12999999999983 | 3.221 |
| 2.13999999999983 | 3.267 |
| 2.149999999999829 | 3.313 |
| 2.159999999999829 | 3.359 |
| 2.169999999999829 | 3.406 |
| 2.179999999999829 | 3.453 |
| 2.189999999999829 | 3.501 |
| 2.199999999999828 | 3.549 |
| 2.209999999999828 | 3.598 |
| 2.219999999999828 | 3.647 |
| 2.229999999999828 | 3.697 |
| 2.239999999999827 | 3.746 |
| 2.249999999999827 | 3.797 |
| 2.259999999999827 | 3.848 |
| 2.269999999999827 | 3.899 |
| 2.279999999999827 | 3.951 |
| 2.289999999999826 | 4.003 |
| 2.299999999999826 | 4.056 |
| 2.309999999999826 | 4.109 |
| 2.319999999999826 | 4.162 |
| 2.329999999999825 | 4.216 |
| 2.339999999999825 | 4.271 |
| 2.349999999999825 | 4.326 |
| 2.359999999999825 | 4.381 |
| 2.369999999999825 | 4.437 |
| 2.379999999999824 | 4.494 |
| 2.389999999999824 | 4.551 |
| 2.399999999999824 | 4.608 |
| 2.409999999999824 | 4.666 |
| 2.419999999999824 | 4.724 |
| 2.429999999999823 | 4.783 |
| 2.439999999999823 | 4.842 |
| 2.449999999999823 | 4.902 |
| 2.459999999999823 | 4.962 |
| 2.469999999999823 | 5.023 |
| 2.479999999999822 | 5.084 |
| 2.489999999999822 | 5.146 |
| 2.499999999999822 | 5.208 |
| 2.509999999999822 | 5.271 |
| 2.519999999999821 | 5.334 |
| 2.529999999999821 | 5.398 |
| 2.539999999999821 | 5.462 |
| 2.549999999999821 | 5.527 |
| 2.559999999999821 | 5.592 |
| 2.56999999999982 | 5.658 |
| 2.57999999999982 | 5.725 |
| 2.58999999999982 | 5.791 |
| 2.59999999999982 | 5.859 |
| 2.609999999999819 | 5.927 |
| 2.619999999999819 | 5.995 |
| 2.629999999999819 | 6.064 |
| 2.639999999999819 | 6.133 |
| 2.649999999999819 | 6.203 |
| 2.659999999999818 | 6.274 |
| 2.669999999999818 | 6.345 |
| 2.679999999999818 | 6.416 |
| 2.689999999999818 | 6.488 |
| 2.699999999999818 | 6.561 |
| 2.709999999999817 | 6.634 |
| 2.719999999999817 | 6.708 |
| 2.729999999999817 | 6.782 |
| 2.739999999999817 | 6.857 |
| 2.749999999999817 | 6.932 |
| 2.759999999999816 | 7.008 |
| 2.769999999999816 | 7.085 |
| 2.779999999999816 | 7.162 |
| 2.789999999999816 | 7.239 |
| 2.799999999999815 | 7.317 |
| 2.809999999999815 | 7.396 |
| 2.819999999999815 | 7.475 |
| 2.829999999999815 | 7.555 |
| 2.839999999999815 | 7.635 |
| 2.849999999999814 | 7.716 |
| 2.859999999999814 | 7.798 |
| 2.869999999999814 | 7.88 |
| 2.879999999999814 | 7.963 |
| 2.889999999999814 | 8.046 |
| 2.899999999999813 | 8.13 |
| 2.909999999999813 | 8.214 |
| 2.919999999999813 | 8.299 |
| 2.929999999999813 | 8.385 |
| 2.939999999999813 | 8.471 |
| 2.949999999999812 | 8.557 |
| 2.959999999999812 | 8.645 |
| 2.969999999999812 | 8.733 |
| 2.979999999999812 | 8.821 |
| 2.989999999999811 | 8.91 |
| 2.999999999999811 | 9 |
| 3.009999999999811 | 9.09 |
| 3.019999999999811 | 9.181 |
| 3.029999999999811 | 9.273 |
| 3.03999999999981 | 9.365 |
| 3.04999999999981 | 9.458 |
| 3.05999999999981 | 9.551 |
| 3.06999999999981 | 9.645 |
| 3.07999999999981 | 9.739 |
| 3.089999999999809 | 9.835 |
| 3.099999999999809 | 9.93 |
| 3.109999999999809 | 10.027 |
| 3.119999999999809 | 10.124 |
| 3.129999999999808 | 10.221 |
| 3.139999999999808 | 10.32 |
| 3.149999999999808 | 10.419 |
| 3.159999999999808 | 10.518 |
| 3.169999999999808 | 10.618 |
| 3.179999999999807 | 10.719 |
| 3.189999999999807 | 10.821 |
| 3.199999999999807 | 10.923 |
| 3.209999999999807 | 11.025 |
| 3.219999999999807 | 11.129 |
| 3.229999999999806 | 11.233 |
| 3.239999999999806 | 11.337 |
| 3.249999999999806 | 11.443 |
| 3.259999999999806 | 11.549 |
| 3.269999999999805 | 11.655 |
| 3.279999999999805 | 11.763 |
| 3.289999999999805 | 11.87 |
| 3.299999999999805 | 11.979 |
| 3.309999999999805 | 12.088 |
| 3.319999999999804 | 12.198 |
| 3.329999999999804 | 12.309 |
| 3.339999999999804 | 12.42 |
| 3.349999999999804 | 12.532 |
| 3.359999999999804 | 12.644 |
| 3.369999999999803 | 12.758 |
| 3.379999999999803 | 12.871 |
| 3.389999999999803 | 12.986 |
| 3.399999999999803 | 13.101 |
| 3.409999999999802 | 13.217 |
| 3.419999999999802 | 13.334 |
| 3.429999999999802 | 13.451 |
| 3.439999999999802 | 13.569 |
| 3.449999999999802 | 13.688 |
| 3.459999999999801 | 13.807 |
| 3.469999999999801 | 13.927 |
| 3.479999999999801 | 14.048 |
| 3.489999999999801 | 14.17 |
| 3.499999999999801 | 14.292 |
| 3.5099999999998 | 14.415 |
| 3.5199999999998 | 14.538 |
| 3.5299999999998 | 14.662 |
| 3.5399999999998 | 14.787 |
| 3.5499999999998 | 14.913 |
| 3.559999999999799 | 15.039 |
| 3.569999999999799 | 15.166 |
| 3.579999999999799 | 15.294 |
| 3.589999999999799 | 15.423 |
| 3.599999999999798 | 15.552 |
| 3.609999999999798 | 15.682 |
| 3.619999999999798 | 15.813 |
| 3.629999999999798 | 15.944 |
| 3.639999999999798 | 16.076 |
| 3.649999999999797 | 16.209 |
| 3.659999999999797 | 16.343 |
| 3.669999999999797 | 16.477 |
| 3.679999999999797 | 16.612 |
| 3.689999999999796 | 16.748 |
| 3.699999999999796 | 16.884 |
| 3.709999999999796 | 17.022 |
| 3.719999999999796 | 17.16 |
| 3.729999999999796 | 17.298 |
| 3.739999999999795 | 17.438 |
| 3.749999999999795 | 17.578 |
| 3.759999999999795 | 17.719 |
| 3.769999999999795 | 17.861 |
| 3.779999999999795 | 18.003 |
| 3.789999999999794 | 18.147 |
| 3.799999999999794 | 18.291 |
| 3.809999999999794 | 18.435 |
| 3.819999999999794 | 18.581 |
| 3.829999999999794 | 18.727 |
| 3.839999999999793 | 18.874 |
| 3.849999999999793 | 19.022 |
| 3.859999999999793 | 19.171 |
| 3.869999999999793 | 19.32 |
| 3.879999999999792 | 19.47 |
| 3.889999999999792 | 19.621 |
| 3.899999999999792 | 19.773 |
| 3.909999999999792 | 19.925 |
| 3.919999999999792 | 20.079 |
| 3.929999999999791 | 20.233 |
| 3.939999999999791 | 20.388 |
| 3.949999999999791 | 20.543 |
| 3.959999999999791 | 20.7 |
| 3.969999999999791 | 20.857 |
| 3.97999999999979 | 21.015 |
| 3.98999999999979 | 21.174 |
| 3.99999999999979 | 21.333 |
| 4.00999999999979 | 21.494 |
| 4.01999999999979 | 21.655 |
| 4.02999999999979 | 21.817 |
| 4.03999999999979 | 21.98 |
| 4.04999999999979 | 22.143 |
| 4.05999999999979 | 22.308 |
| 4.069999999999789 | 22.473 |
| 4.079999999999788 | 22.639 |
| 4.089999999999788 | 22.806 |
| 4.099999999999788 | 22.974 |
| 4.109999999999788 | 23.142 |
| 4.119999999999788 | 23.312 |
| 4.129999999999788 | 23.482 |
| 4.139999999999787 | 23.653 |
| 4.149999999999787 | 23.824 |
| 4.159999999999787 | 23.997 |
| 4.169999999999787 | 24.171 |
| 4.179999999999786 | 24.345 |
| 4.189999999999786 | 24.52 |
| 4.199999999999786 | 24.696 |
| 4.209999999999785 | 24.873 |
| 4.219999999999785 | 25.05 |
| 4.229999999999785 | 25.229 |
| 4.239999999999785 | 25.408 |
| 4.249999999999785 | 25.589 |
| 4.259999999999784 | 25.77 |
| 4.269999999999784 | 25.951 |
| 4.279999999999784 | 26.134 |
| 4.289999999999784 | 26.318 |
| 4.299999999999784 | 26.502 |
| 4.309999999999784 | 26.688 |
| 4.319999999999784 | 26.874 |
| 4.329999999999783 | 27.061 |
| 4.339999999999783 | 27.249 |
| 4.349999999999783 | 27.438 |
| 4.359999999999783 | 27.627 |
| 4.369999999999782 | 27.818 |
| 4.379999999999782 | 28.009 |
| 4.389999999999782 | 28.202 |
| 4.399999999999782 | 28.395 |
| 4.409999999999781 | 28.589 |
| 4.419999999999781 | 28.784 |
| 4.429999999999781 | 28.979 |
| 4.43999999999978 | 29.176 |
| 4.44999999999978 | 29.374 |
| 4.45999999999978 | 29.572 |
| 4.46999999999978 | 29.772 |
| 4.47999999999978 | 29.972 |
| 4.48999999999978 | 30.173 |
| 4.49999999999978 | 30.375 |
| 4.50999999999978 | 30.578 |
| 4.51999999999978 | 30.782 |
| 4.52999999999978 | 30.987 |
| 4.539999999999778 | 31.192 |
| 4.549999999999778 | 31.399 |
| 4.559999999999778 | 31.606 |
| 4.569999999999778 | 31.815 |
| 4.579999999999778 | 32.024 |
| 4.589999999999777 | 32.234 |
| 4.599999999999777 | 32.445 |
| 4.609999999999777 | 32.657 |
| 4.619999999999777 | 32.87 |
| 4.629999999999777 | 33.084 |
| 4.639999999999776 | 33.299 |
| 4.649999999999776 | 33.515 |
| 4.659999999999776 | 33.732 |
| 4.669999999999776 | 33.949 |
| 4.679999999999775 | 34.168 |
| 4.689999999999775 | 34.387 |
| 4.699999999999775 | 34.608 |
| 4.709999999999775 | 34.829 |
| 4.719999999999774 | 35.051 |
| 4.729999999999774 | 35.275 |
| 4.739999999999774 | 35.499 |
| 4.749999999999774 | 35.724 |
| 4.759999999999774 | 35.95 |
| 4.769999999999774 | 36.177 |
| 4.779999999999773 | 36.405 |
| 4.789999999999773 | 36.634 |
| 4.799999999999773 | 36.864 |
| 4.809999999999773 | 37.095 |
| 4.819999999999773 | 37.327 |
| 4.829999999999773 | 37.56 |
| 4.839999999999772 | 37.793 |
| 4.849999999999772 | 38.028 |
| 4.859999999999772 | 38.264 |
| 4.869999999999772 | 38.5 |
| 4.879999999999771 | 38.738 |
| 4.889999999999771 | 38.977 |
| 4.899999999999771 | 39.216 |
| 4.90999999999977 | 39.457 |
| 4.91999999999977 | 39.698 |
| 4.92999999999977 | 39.941 |
| 4.93999999999977 | 40.185 |
| 4.94999999999977 | 40.429 |
| 4.95999999999977 | 40.675 |
| 4.96999999999977 | 40.921 |
| 4.97999999999977 | 41.169 |
| 4.98999999999977 | 41.417 |
| 4.99999999999977 | 41.667 |
| 5.009999999999768 | 41.917 |
| 5.019999999999768 | 42.169 |
| 5.029999999999768 | 42.421 |
| 5.039999999999768 | 42.675 |
| 5.049999999999767 | 42.929 |
| 5.059999999999767 | 43.185 |
| 5.069999999999767 | 43.441 |
| 5.079999999999767 | 43.699 |
| 5.089999999999767 | 43.957 |
| 5.099999999999766 | 44.217 |
| 5.109999999999766 | 44.478 |
| 5.119999999999766 | 44.739 |
| 5.129999999999766 | 45.002 |
| 5.139999999999766 | 45.266 |
| 5.149999999999765 | 45.53 |
| 5.159999999999765 | 45.796 |
| 5.169999999999765 | 46.063 |
| 5.179999999999765 | 46.331 |
| 5.189999999999764 | 46.599 |
| 5.199999999999764 | 46.869 |
| 5.209999999999764 | 47.14 |
| 5.219999999999764 | 47.412 |
| 5.229999999999764 | 47.685 |
| 5.239999999999763 | 47.959 |
| 5.249999999999763 | 48.234 |
| 5.259999999999763 | 48.511 |
| 5.269999999999763 | 48.788 |
| 5.279999999999763 | 49.066 |
| 5.289999999999762 | 49.345 |
| 5.299999999999762 | 49.626 |
| 5.309999999999762 | 49.907 |
| 5.319999999999762 | 50.19 |
| 5.329999999999762 | 50.473 |
| 5.339999999999761 | 50.758 |
| 5.349999999999761 | 51.043 |
| 5.359999999999761 | 51.33 |
| 5.369999999999761 | 51.618 |
| 5.37999999999976 | 51.907 |
| 5.38999999999976 | 52.197 |
| 5.39999999999976 | 52.488 |
| 5.40999999999976 | 52.78 |
| 5.41999999999976 | 53.073 |
| 5.42999999999976 | 53.368 |
| 5.43999999999976 | 53.663 |
| 5.44999999999976 | 53.96 |
| 5.45999999999976 | 54.257 |
| 5.46999999999976 | 54.556 |
| 5.479999999999758 | 54.856 |
| 5.489999999999758 | 55.156 |
| 5.499999999999758 | 55.458 |
| 5.509999999999758 | 55.761 |
| 5.519999999999758 | 56.066 |
| 5.529999999999758 | 56.371 |
| 5.539999999999757 | 56.677 |
| 5.549999999999757 | 56.985 |
| 5.559999999999757 | 57.293 |
| 5.569999999999757 | 57.603 |
| 5.579999999999756 | 57.914 |
| 5.589999999999756 | 58.226 |
| 5.599999999999756 | 58.539 |
| 5.609999999999756 | 58.853 |
| 5.619999999999756 | 59.168 |
| 5.629999999999756 | 59.485 |
| 5.639999999999755 | 59.802 |
| 5.649999999999755 | 60.121 |
| 5.659999999999755 | 60.44 |
| 5.669999999999755 | 60.761 |
| 5.679999999999754 | 61.083 |
| 5.689999999999754 | 61.407 |
| 5.699999999999754 | 61.731 |
| 5.709999999999754 | 62.056 |
| 5.719999999999754 | 62.383 |
| 5.729999999999753 | 62.711 |
| 5.739999999999753 | 63.04 |
| 5.749999999999753 | 63.37 |
| 5.759999999999753 | 63.701 |
| 5.769999999999753 | 64.033 |
| 5.779999999999752 | 64.367 |
| 5.789999999999752 | 64.702 |
| 5.799999999999752 | 65.037 |
| 5.809999999999752 | 65.374 |
| 5.819999999999752 | 65.712 |
| 5.829999999999751 | 66.052 |
| 5.839999999999751 | 66.392 |
| 5.849999999999751 | 66.734 |
| 5.859999999999751 | 67.077 |
| 5.86999999999975 | 67.421 |
| 5.87999999999975 | 67.766 |
| 5.88999999999975 | 68.112 |
| 5.89999999999975 | 68.46 |
| 5.90999999999975 | 68.808 |
| 5.91999999999975 | 69.158 |
| 5.92999999999975 | 69.509 |
| 5.93999999999975 | 69.862 |
| 5.949999999999748 | 70.215 |
| 5.959999999999748 | 70.57 |
| 5.969999999999748 | 70.925 |
| 5.979999999999748 | 71.282 |
| 5.989999999999747 | 71.641 |
| 5.999999999999747 | 72 |
| 6.009999999999747 | 72.361 |
| 6.019999999999747 | 72.722 |
| 6.029999999999747 | 73.085 |
| 6.039999999999746 | 73.45 |
| 6.049999999999746 | 73.815 |
| 6.059999999999746 | 74.182 |
| 6.069999999999746 | 74.55 |
| 6.079999999999746 | 74.919 |
| 6.089999999999745 | 75.289 |
| 6.099999999999745 | 75.66 |
| 6.109999999999745 | 76.033 |
| 6.119999999999745 | 76.407 |
| 6.129999999999745 | 76.782 |
| 6.139999999999744 | 77.159 |
| 6.149999999999744 | 77.536 |
| 6.159999999999744 | 77.915 |
| 6.169999999999744 | 78.295 |
| 6.179999999999744 | 78.676 |
| 6.189999999999744 | 79.059 |
| 6.199999999999743 | 79.443 |
| 6.209999999999743 | 79.828 |
| 6.219999999999743 | 80.214 |
| 6.229999999999743 | 80.601 |
| 6.239999999999742 | 80.99 |
| 6.249999999999742 | 81.38 |
| 6.259999999999742 | 81.771 |
| 6.269999999999742 | 82.164 |
| 6.279999999999741 | 82.558 |
| 6.289999999999741 | 82.953 |
| 6.299999999999741 | 83.349 |
| 6.309999999999741 | 83.747 |
| 6.319999999999741 | 84.145 |
| 6.329999999999741 | 84.545 |
| 6.33999999999974 | 84.947 |
| 6.34999999999974 | 85.349 |
| 6.35999999999974 | 85.753 |
| 6.36999999999974 | 86.158 |
| 6.37999999999974 | 86.565 |
| 6.38999999999974 | 86.972 |
| 6.39999999999974 | 87.381 |
| 6.409999999999738 | 87.792 |
| 6.419999999999738 | 88.203 |
| 6.429999999999738 | 88.616 |
| 6.439999999999738 | 89.03 |
| 6.449999999999738 | 89.445 |
| 6.459999999999737 | 89.862 |
| 6.469999999999737 | 90.28 |
| 6.479999999999737 | 90.699 |
| 6.489999999999737 | 91.12 |
| 6.499999999999737 | 91.542 |
| 6.509999999999736 | 91.965 |
| 6.519999999999736 | 92.389 |
| 6.529999999999736 | 92.815 |
| 6.539999999999736 | 93.242 |
| 6.549999999999736 | 93.67 |
| 6.559999999999735 | 94.1 |
| 6.569999999999735 | 94.531 |
| 6.579999999999735 | 94.963 |
| 6.589999999999735 | 95.397 |
| 6.599999999999734 | 95.832 |
| 6.609999999999734 | 96.268 |
| 6.619999999999734 | 96.706 |
| 6.629999999999734 | 97.145 |
| 6.639999999999734 | 97.585 |
| 6.649999999999734 | 98.027 |
| 6.659999999999734 | 98.469 |
| 6.669999999999733 | 98.914 |
| 6.679999999999733 | 99.359 |
| 6.689999999999733 | 99.806 |
| 6.699999999999733 | 100.254 |
| 6.709999999999732 | 100.704 |
| 6.719999999999732 | 101.155 |
| 6.729999999999732 | 101.607 |
| 6.739999999999731 | 102.061 |
| 6.749999999999731 | 102.516 |
| 6.759999999999731 | 102.972 |
| 6.769999999999731 | 103.43 |
| 6.77999999999973 | 103.889 |
| 6.78999999999973 | 104.349 |
| 6.79999999999973 | 104.811 |
| 6.80999999999973 | 105.274 |
| 6.81999999999973 | 105.738 |
| 6.82999999999973 | 106.204 |
| 6.83999999999973 | 106.671 |
| 6.84999999999973 | 107.14 |
| 6.85999999999973 | 107.61 |
| 6.86999999999973 | 108.081 |
| 6.879999999999728 | 108.554 |
| 6.889999999999728 | 109.028 |
| 6.899999999999728 | 109.503 |
| 6.909999999999728 | 109.98 |
| 6.919999999999728 | 110.458 |
| 6.929999999999727 | 110.938 |
| 6.939999999999727 | 111.418 |
| 6.949999999999727 | 111.901 |
| 6.959999999999727 | 112.385 |
| 6.969999999999727 | 112.87 |
| 6.979999999999726 | 113.356 |
| 6.989999999999726 | 113.844 |
| 6.999999999999726 | 114.333 |
| 7.009999999999726 | 114.824 |
| 7.019999999999726 | 115.316 |
| 7.029999999999725 | 115.81 |
| 7.039999999999725 | 116.305 |
| 7.049999999999725 | 116.801 |
| 7.059999999999725 | 117.299 |
| 7.069999999999724 | 117.798 |
| 7.079999999999724 | 118.298 |
| 7.089999999999724 | 118.8 |
| 7.099999999999724 | 119.304 |
| 7.109999999999724 | 119.808 |
| 7.119999999999724 | 120.315 |
| 7.129999999999724 | 120.822 |
| 7.139999999999723 | 121.331 |
| 7.149999999999723 | 121.842 |
| 7.159999999999723 | 122.354 |
| 7.169999999999723 | 122.867 |
| 7.179999999999722 | 123.382 |
| 7.189999999999722 | 123.898 |
| 7.199999999999722 | 124.416 |
| 7.209999999999721 | 124.935 |
| 7.219999999999721 | 125.456 |
| 7.229999999999721 | 125.978 |
| 7.23999999999972 | 126.501 |
| 7.24999999999972 | 127.026 |
| 7.25999999999972 | 127.552 |
| 7.26999999999972 | 128.08 |
| 7.27999999999972 | 128.609 |
| 7.28999999999972 | 129.14 |
| 7.29999999999972 | 129.672 |
| 7.30999999999972 | 130.206 |
| 7.31999999999972 | 130.741 |
| 7.329999999999719 | 131.278 |
| 7.33999999999972 | 131.816 |
| 7.349999999999719 | 132.355 |
| 7.359999999999719 | 132.896 |
| 7.369999999999718 | 133.439 |
| 7.379999999999718 | 133.982 |
| 7.389999999999718 | 134.528 |
| 7.399999999999718 | 135.075 |
| 7.409999999999717 | 135.623 |
| 7.419999999999717 | 136.173 |
| 7.429999999999717 | 136.724 |
| 7.439999999999717 | 137.277 |
| 7.449999999999716 | 137.831 |
| 7.459999999999716 | 138.387 |
| 7.469999999999716 | 138.944 |
| 7.479999999999716 | 139.503 |
| 7.489999999999715 | 140.063 |
| 7.499999999999715 | 140.625 |
| 7.509999999999715 | 141.188 |
| 7.519999999999715 | 141.753 |
| 7.529999999999715 | 142.319 |
| 7.539999999999714 | 142.887 |
| 7.549999999999714 | 143.456 |
| 7.559999999999714 | 144.027 |
| 7.569999999999714 | 144.599 |
| 7.579999999999714 | 145.173 |
| 7.589999999999714 | 145.748 |
| 7.599999999999714 | 146.325 |
| 7.609999999999713 | 146.904 |
| 7.619999999999713 | 147.484 |
| 7.629999999999713 | 148.065 |
| 7.639999999999713 | 148.648 |
| 7.649999999999712 | 149.232 |
| 7.659999999999712 | 149.818 |
| 7.669999999999712 | 150.406 |
| 7.679999999999712 | 150.995 |
| 7.689999999999712 | 151.586 |
| 7.699999999999711 | 152.178 |
| 7.709999999999711 | 152.771 |
| 7.719999999999711 | 153.367 |
| 7.729999999999711 | 153.963 |
| 7.73999999999971 | 154.562 |
| 7.74999999999971 | 155.161 |
| 7.75999999999971 | 155.763 |
| 7.76999999999971 | 156.366 |
| 7.77999999999971 | 156.97 |
| 7.78999999999971 | 157.576 |
| 7.79999999999971 | 158.184 |
| 7.80999999999971 | 158.793 |
| 7.819999999999709 | 159.404 |
| 7.829999999999709 | 160.016 |
| 7.839999999999708 | 160.63 |
| 7.849999999999708 | 161.246 |
| 7.859999999999708 | 161.863 |
| 7.869999999999708 | 162.481 |
| 7.879999999999707 | 163.101 |
| 7.889999999999707 | 163.723 |
| 7.899999999999707 | 164.346 |
| 7.909999999999707 | 164.971 |
| 7.919999999999706 | 165.598 |
| 7.929999999999706 | 166.226 |
| 7.939999999999706 | 166.855 |
| 7.949999999999706 | 167.487 |
| 7.959999999999705 | 168.119 |
| 7.969999999999705 | 168.754 |
| 7.979999999999705 | 169.39 |
| 7.989999999999705 | 170.027 |
| 7.999999999999705 | 170.667 |
| 8.009999999999703 | 171.307 |
| 8.019999999999705 | 171.95 |
| 8.029999999999704 | 172.594 |
| 8.039999999999704 | 173.239 |
| 8.049999999999704 | 173.887 |
| 8.059999999999704 | 174.536 |
| 8.069999999999704 | 175.186 |
| 8.079999999999703 | 175.838 |
| 8.089999999999703 | 176.492 |
| 8.099999999999701 | 177.147 |
| 8.109999999999703 | 177.804 |
| 8.119999999999703 | 178.462 |
| 8.129999999999702 | 179.123 |
| 8.139999999999702 | 179.784 |
| 8.1499999999997 | 180.448 |
| 8.1599999999997 | 181.113 |
| 8.1699999999997 | 181.78 |
| 8.1799999999997 | 182.448 |
| 8.1899999999997 | 183.118 |
| 8.1999999999997 | 183.789 |
| 8.2099999999997 | 184.463 |
| 8.2199999999997 | 185.137 |
| 8.2299999999997 | 185.814 |
| 8.2399999999997 | 186.492 |
| 8.2499999999997 | 187.172 |
| 8.2599999999997 | 187.853 |
| 8.2699999999997 | 188.536 |
| 8.2799999999997 | 189.221 |
| 8.289999999999697 | 189.908 |
| 8.299999999999699 | 190.596 |
| 8.309999999999699 | 191.285 |
| 8.319999999999698 | 191.977 |
| 8.329999999999698 | 192.67 |
| 8.339999999999698 | 193.365 |
| 8.349999999999698 | 194.061 |
| 8.359999999999697 | 194.759 |
| 8.369999999999697 | 195.459 |
| 8.379999999999695 | 196.16 |
| 8.389999999999697 | 196.863 |
| 8.399999999999697 | 197.568 |
| 8.409999999999696 | 198.274 |
| 8.419999999999696 | 198.983 |
| 8.429999999999694 | 199.692 |
| 8.439999999999696 | 200.404 |
| 8.449999999999696 | 201.117 |
| 8.459999999999695 | 201.832 |
| 8.469999999999695 | 202.548 |
| 8.479999999999693 | 203.267 |
| 8.489999999999695 | 203.987 |
| 8.499999999999694 | 204.708 |
| 8.509999999999694 | 205.432 |
| 8.519999999999694 | 206.157 |
| 8.529999999999694 | 206.883 |
| 8.539999999999694 | 207.612 |
| 8.549999999999693 | 208.342 |
| 8.55999999999969 | 209.074 |
| 8.56999999999969 | 209.808 |
| 8.57999999999969 | 210.543 |
| 8.58999999999969 | 211.28 |
| 8.59999999999969 | 212.019 |
| 8.60999999999969 | 212.759 |
| 8.61999999999969 | 213.501 |
| 8.62999999999969 | 214.245 |
| 8.63999999999969 | 214.991 |
| 8.64999999999969 | 215.738 |
| 8.65999999999969 | 216.487 |
| 8.66999999999969 | 217.238 |
| 8.67999999999969 | 217.991 |
| 8.68999999999969 | 218.745 |
| 8.69999999999969 | 219.501 |
| 8.70999999999969 | 220.259 |
| 8.71999999999969 | 221.018 |
| 8.72999999999969 | 221.78 |
| 8.73999999999969 | 222.543 |
| 8.74999999999969 | 223.307 |
| 8.759999999999687 | 224.074 |
| 8.769999999999689 | 224.842 |
| 8.779999999999688 | 225.612 |
| 8.789999999999688 | 226.384 |
| 8.799999999999686 | 227.157 |
| 8.809999999999688 | 227.933 |
| 8.819999999999688 | 228.71 |
| 8.829999999999687 | 229.488 |
| 8.839999999999687 | 230.269 |
| 8.849999999999685 | 231.051 |
| 8.859999999999687 | 231.835 |
| 8.869999999999687 | 232.621 |
| 8.879999999999686 | 233.409 |
| 8.889999999999686 | 234.198 |
| 8.899999999999684 | 234.99 |
| 8.909999999999686 | 235.783 |
| 8.919999999999686 | 236.577 |
| 8.929999999999685 | 237.374 |
| 8.939999999999685 | 238.172 |
| 8.949999999999685 | 238.972 |
| 8.959999999999685 | 239.774 |
| 8.969999999999684 | 240.578 |
| 8.979999999999684 | 241.384 |
| 8.989999999999682 | 242.191 |
| 8.999999999999684 | 243 |
| 9.009999999999684 | 243.811 |
| 9.019999999999683 | 244.624 |
| 9.029999999999683 | 245.438 |
| 9.039999999999681 | 246.254 |
| 9.049999999999683 | 247.073 |
| 9.05999999999968 | 247.892 |
| 9.06999999999968 | 248.714 |
| 9.07999999999968 | 249.538 |
| 9.08999999999968 | 250.363 |
| 9.09999999999968 | 251.19 |
| 9.10999999999968 | 252.019 |
| 9.11999999999968 | 252.85 |
| 9.12999999999968 | 253.683 |
| 9.13999999999968 | 254.517 |
| 9.14999999999968 | 255.354 |
| 9.15999999999968 | 256.192 |
| 9.16999999999968 | 257.032 |
| 9.17999999999968 | 257.874 |
| 9.18999999999968 | 258.717 |
| 9.19999999999968 | 259.563 |
| 9.20999999999968 | 260.41 |
| 9.21999999999968 | 261.259 |
| 9.229999999999677 | 262.11 |
| 9.239999999999679 | 262.963 |
| 9.249999999999678 | 263.818 |
| 9.259999999999678 | 264.674 |
| 9.269999999999678 | 265.533 |
| 9.279999999999678 | 266.393 |
| 9.289999999999678 | 267.255 |
| 9.299999999999677 | 268.119 |
| 9.309999999999677 | 268.985 |
| 9.319999999999675 | 269.853 |
| 9.329999999999677 | 270.722 |
| 9.339999999999677 | 271.594 |
| 9.349999999999676 | 272.467 |
| 9.359999999999676 | 273.342 |
| 9.369999999999674 | 274.219 |
| 9.379999999999676 | 275.098 |
| 9.389999999999675 | 275.979 |
| 9.399999999999675 | 276.861 |
| 9.409999999999675 | 277.746 |
| 9.419999999999675 | 278.632 |
| 9.429999999999675 | 279.521 |
| 9.439999999999674 | 280.411 |
| 9.449999999999674 | 281.303 |
| 9.459999999999672 | 282.197 |
| 9.469999999999674 | 283.093 |
| 9.479999999999674 | 283.99 |
| 9.489999999999673 | 284.89 |
| 9.499999999999673 | 285.792 |
| 9.509999999999671 | 286.695 |
| 9.519999999999673 | 287.6 |
| 9.529999999999673 | 288.508 |
| 9.539999999999672 | 289.417 |
| 9.549999999999672 | 290.328 |
| 9.55999999999967 | 291.241 |
| 9.56999999999967 | 292.156 |
| 9.57999999999967 | 293.073 |
| 9.58999999999967 | 293.991 |
| 9.59999999999967 | 294.912 |
| 9.60999999999967 | 295.835 |
| 9.61999999999967 | 296.759 |
| 9.62999999999967 | 297.685 |
| 9.63999999999967 | 298.614 |
| 9.64999999999967 | 299.544 |
| 9.65999999999967 | 300.476 |
| 9.66999999999967 | 301.41 |
| 9.67999999999967 | 302.346 |
| 9.689999999999667 | 303.284 |
| 9.699999999999669 | 304.224 |
| 9.709999999999669 | 305.166 |
| 9.719999999999668 | 306.11 |
| 9.729999999999668 | 307.056 |
| 9.739999999999666 | 308.003 |
| 9.749999999999668 | 308.953 |
| 9.759999999999668 | 309.905 |
| 9.769999999999667 | 310.858 |
| 9.779999999999667 | 311.814 |
| 9.789999999999665 | 312.771 |
| 9.799999999999667 | 313.731 |
| 9.809999999999667 | 314.692 |
| 9.819999999999666 | 315.655 |
| 9.829999999999666 | 316.621 |
| 9.839999999999664 | 317.588 |
| 9.849999999999666 | 318.557 |
| 9.859999999999665 | 319.528 |
| 9.869999999999665 | 320.502 |
| 9.879999999999663 | 321.477 |
| 9.889999999999665 | 322.454 |
| 9.899999999999665 | 323.433 |
| 9.909999999999664 | 324.414 |
| 9.919999999999664 | 325.397 |
| 9.929999999999662 | 326.382 |
| 9.939999999999664 | 327.369 |
| 9.949999999999664 | 328.358 |
| 9.95999999999966 | 329.349 |
| 9.96999999999966 | 330.342 |
| 9.97999999999966 | 331.337 |
| 9.98999999999966 | 332.334 |
| 9.99999999999966 | 333.333 |